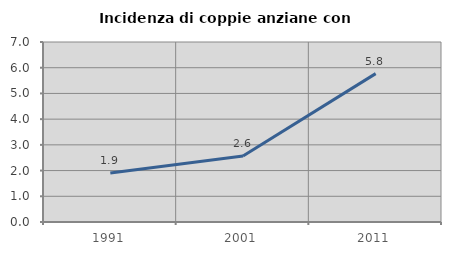
| Category | Incidenza di coppie anziane con figli |
|---|---|
| 1991.0 | 1.905 |
| 2001.0 | 2.564 |
| 2011.0 | 5.769 |